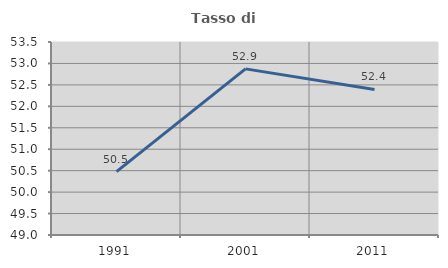
| Category | Tasso di occupazione   |
|---|---|
| 1991.0 | 50.479 |
| 2001.0 | 52.873 |
| 2011.0 | 52.393 |